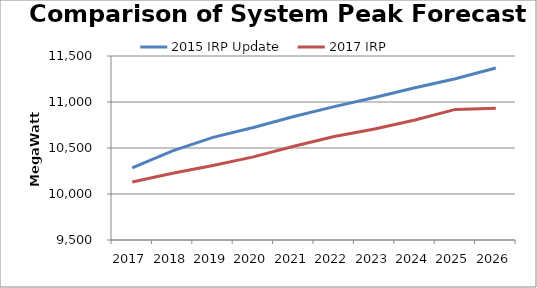
| Category | 2015 IRP Update | 2017 IRP |
|---|---|---|
| 2017.0 | 10283.047 | 10129.885 |
| 2018.0 | 10469.399 | 10224.713 |
| 2019.0 | 10615.721 | 10310.015 |
| 2020.0 | 10722.35 | 10403.218 |
| 2021.0 | 10841.65 | 10518.418 |
| 2022.0 | 10949.748 | 10624.16 |
| 2023.0 | 11049.543 | 10706.388 |
| 2024.0 | 11154.565 | 10804.439 |
| 2025.0 | 11252.559 | 10919.631 |
| 2026.0 | 11369.564 | 10931.281 |